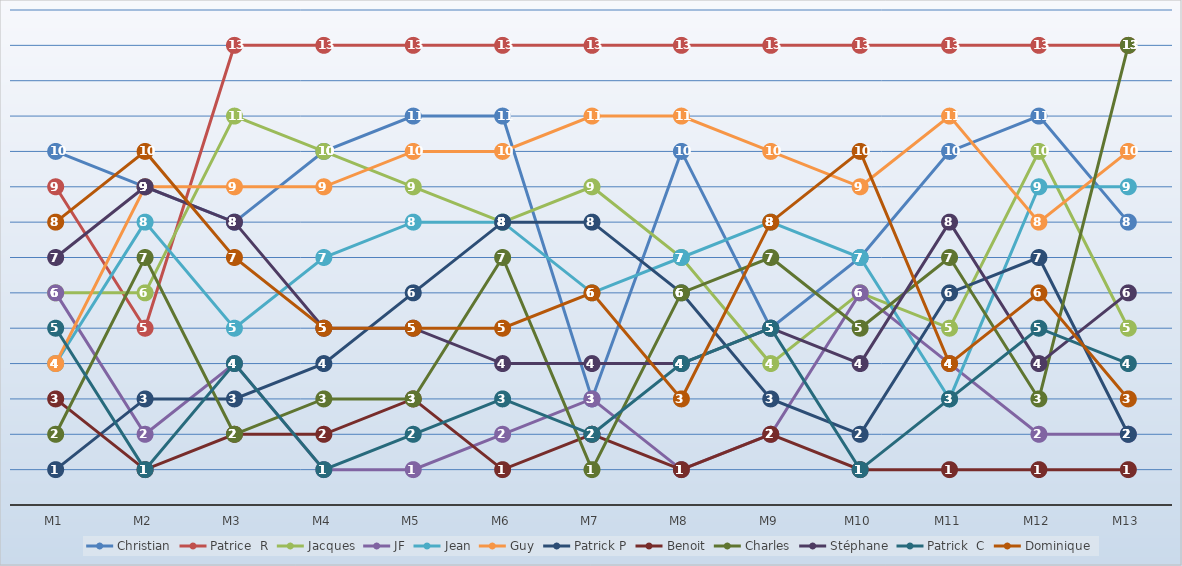
| Category | Christian | Patrice  R | Jacques | JF | Jean | Guy | Patrick P | Benoit | Charles | Stéphane | Patrick  C | Dominique |
|---|---|---|---|---|---|---|---|---|---|---|---|---|
| M1 | 10 | 9 | 6 | 6 | 4 | 4 | 1 | 3 | 2 | 7 | 5 | 8 |
| M2 | 9 | 5 | 6 | 2 | 8 | 9 | 3 | 1 | 7 | 9 | 1 | 10 |
| M3 | 8 | 13 | 11 | 4 | 5 | 9 | 3 | 2 | 2 | 8 | 4 | 7 |
| M4 | 10 | 13 | 10 | 1 | 7 | 9 | 4 | 2 | 3 | 5 | 1 | 5 |
| M5 | 11 | 13 | 9 | 1 | 8 | 10 | 6 | 3 | 3 | 5 | 2 | 5 |
| M6 | 11 | 13 | 8 | 2 | 8 | 10 | 8 | 1 | 7 | 4 | 3 | 5 |
| M7 | 3 | 13 | 9 | 3 | 6 | 11 | 8 | 2 | 1 | 4 | 2 | 6 |
| M8 | 10 | 13 | 7 | 1 | 7 | 11 | 6 | 1 | 6 | 4 | 4 | 3 |
| M9 | 5 | 13 | 4 | 2 | 8 | 10 | 3 | 2 | 7 | 5 | 5 | 8 |
| M10 | 7 | 13 | 6 | 6 | 7 | 9 | 2 | 1 | 5 | 4 | 1 | 10 |
| M11 | 10 | 13 | 5 | 4 | 3 | 11 | 6 | 1 | 7 | 8 | 3 | 4 |
| M12 | 11 | 13 | 10 | 2 | 9 | 8 | 7 | 1 | 3 | 4 | 5 | 6 |
| M13 | 8 | 13 | 5 | 2 | 9 | 10 | 2 | 1 | 13 | 6 | 4 | 3 |